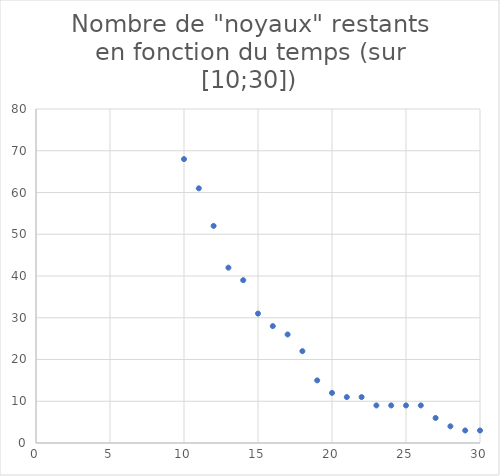
| Category | Series 0 |
|---|---|
| 10.0 | 68 |
| 11.0 | 61 |
| 12.0 | 52 |
| 13.0 | 42 |
| 14.0 | 39 |
| 15.0 | 31 |
| 16.0 | 28 |
| 17.0 | 26 |
| 18.0 | 22 |
| 19.0 | 15 |
| 20.0 | 12 |
| 21.0 | 11 |
| 22.0 | 11 |
| 23.0 | 9 |
| 24.0 | 9 |
| 25.0 | 9 |
| 26.0 | 9 |
| 27.0 | 6 |
| 28.0 | 4 |
| 29.0 | 3 |
| 30.0 | 3 |